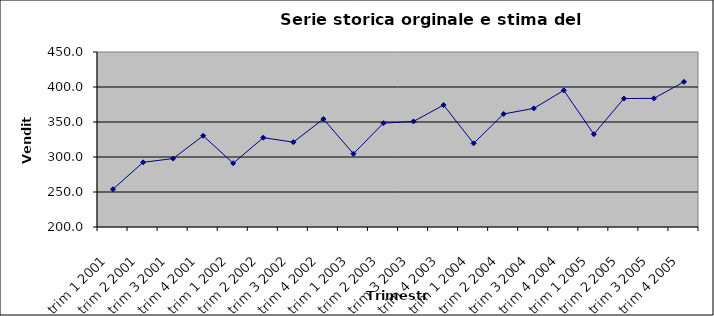
| Category | y | Series 1 |
|---|---|---|
| trim 1 2001 | 254 |  |
| trim 2 2001 | 292.4 |  |
| trim 3 2001 | 297.8 |  |
| trim 4 2001 | 330.3 |  |
| trim 1 2002 | 291.1 |  |
| trim 2 2002 | 327.6 |  |
| trim 3 2002 | 321.2 |  |
| trim 4 2002 | 354.3 |  |
| trim 1 2003 | 304.6 |  |
| trim 2 2003 | 348.4 |  |
| trim 3 2003 | 350.8 |  |
| trim 4 2003 | 374.2 |  |
| trim 1 2004 | 319.5 |  |
| trim 2 2004 | 361.5 |  |
| trim 3 2004 | 369.4 |  |
| trim 4 2004 | 395.2 |  |
| trim 1 2005 | 332.6 |  |
| trim 2 2005 | 383.5 |  |
| trim 3 2005 | 383.8 |  |
| trim 4 2005 | 407.4 |  |